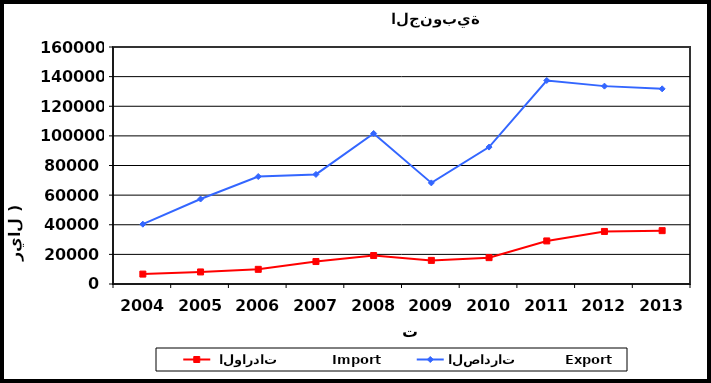
| Category |  الواردات           Import | الصادرات          Export |
|---|---|---|
| 2004.0 | 6688 | 40382 |
| 2005.0 | 8138 | 57368 |
| 2006.0 | 9900 | 72570 |
| 2007.0 | 15162 | 73972 |
| 2008.0 | 19218 | 101621 |
| 2009.0 | 15931 | 68263 |
| 2010.0 | 17789 | 92431 |
| 2011.0 | 29076 | 137392 |
| 2012.0 | 35467 | 133585 |
| 2013.0 | 36018 | 131750 |